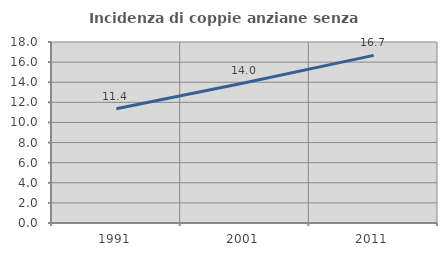
| Category | Incidenza di coppie anziane senza figli  |
|---|---|
| 1991.0 | 11.354 |
| 2001.0 | 13.953 |
| 2011.0 | 16.667 |